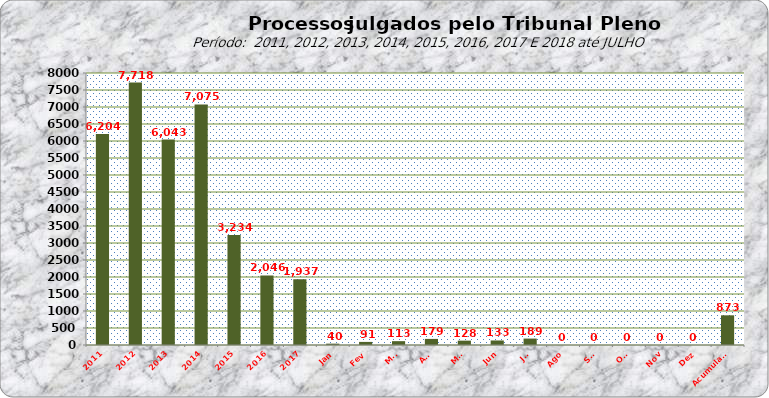
| Category | Series 0 |
|---|---|
| 2011 | 6204 |
| 2012 | 7718 |
| 2013 | 6043 |
| 2014 | 7075 |
| 2015 | 3234 |
| 2016 | 2046 |
| 2017 | 1937 |
| Jan | 40 |
| Fev | 91 |
| Mar | 113 |
| Abr | 179 |
| Mai | 128 |
| Jun | 133 |
| Jul | 189 |
| Ago | 0 |
| Set | 0 |
| Out | 0 |
| Nov | 0 |
| Dez | 0 |
| Acumulado | 873 |